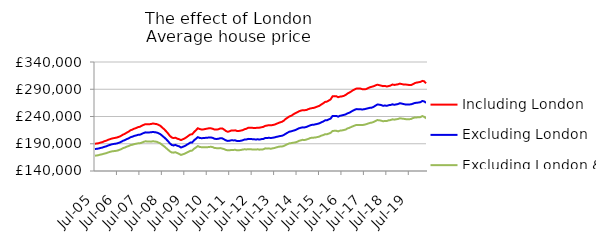
| Category | Including London | Excluding London | Excluding London & SE |
|---|---|---|---|
| 2005-07-01 | 190099.846 | 180338.943 | 168115.943 |
| 2005-08-01 | 190409.416 | 180707.116 | 168387.745 |
| 2005-09-01 | 191025.705 | 181294.079 | 169165.237 |
| 2005-10-01 | 192128.229 | 182260.003 | 170136.846 |
| 2005-11-01 | 193022.749 | 183020.557 | 170802.395 |
| 2005-12-01 | 194589.472 | 184321.051 | 171890.78 |
| 2006-01-01 | 195561.889 | 185223.855 | 172601.05 |
| 2006-02-01 | 197180.233 | 186694.526 | 173973.307 |
| 2006-03-01 | 198290.018 | 187883.534 | 175074.67 |
| 2006-04-01 | 199521.21 | 188954.872 | 175987.174 |
| 2006-05-01 | 200291.878 | 189620.06 | 176437.969 |
| 2006-06-01 | 200874.24 | 190048.53 | 176847.591 |
| 2006-07-01 | 201753.772 | 190830.896 | 177451.803 |
| 2006-08-01 | 202945.476 | 191932.237 | 178625.067 |
| 2006-09-01 | 204665.909 | 193486.107 | 180029.257 |
| 2006-10-01 | 206669.853 | 195431.198 | 181917.714 |
| 2006-11-01 | 208271.992 | 196704.296 | 182996.889 |
| 2006-12-01 | 210431.706 | 198484.218 | 184628.33 |
| 2007-01-01 | 212236.573 | 199867.99 | 185753.039 |
| 2007-02-01 | 214691.924 | 201953.448 | 187491.53 |
| 2007-03-01 | 215960.598 | 202950.014 | 188129.855 |
| 2007-04-01 | 217668.208 | 204390.327 | 189305.612 |
| 2007-05-01 | 218745.526 | 205176.529 | 190051.523 |
| 2007-06-01 | 220436.757 | 206350.676 | 190766.928 |
| 2007-07-01 | 221128.98 | 206601.586 | 190934.336 |
| 2007-08-01 | 222903.284 | 208023.687 | 191970.933 |
| 2007-09-01 | 224639.27 | 209648.69 | 193488.751 |
| 2007-10-01 | 225909.983 | 210886.574 | 194554.085 |
| 2007-11-01 | 225637.65 | 210701.658 | 194139.319 |
| 2007-12-01 | 225795.991 | 210808.016 | 194100.151 |
| 2008-01-01 | 226230.744 | 210997.948 | 193849.067 |
| 2008-02-01 | 227150.677 | 211685.752 | 194629.825 |
| 2008-03-01 | 226536.237 | 211131.036 | 194027.854 |
| 2008-04-01 | 226088.749 | 210687.499 | 193735.581 |
| 2008-05-01 | 224583.894 | 209243.33 | 192031.653 |
| 2008-06-01 | 222870.934 | 207605.676 | 190599.84 |
| 2008-07-01 | 219624.904 | 204552.197 | 187738.181 |
| 2008-08-01 | 216697.269 | 201783.679 | 185273.991 |
| 2008-09-01 | 213087.292 | 198550.708 | 182220.184 |
| 2008-10-01 | 209193.305 | 194954.131 | 179292.765 |
| 2008-11-01 | 204692.274 | 190946.059 | 176189.96 |
| 2008-12-01 | 201599.231 | 187849.92 | 174117.242 |
| 2009-01-01 | 200403.32 | 186878.072 | 173689.928 |
| 2009-02-01 | 201116.809 | 187902.199 | 174505.275 |
| 2009-03-01 | 199383.582 | 186328.236 | 172948.571 |
| 2009-04-01 | 198315.606 | 185259.882 | 171374.665 |
| 2009-05-01 | 196756.715 | 183093.397 | 169466.686 |
| 2009-06-01 | 198255.489 | 184493.743 | 170575.472 |
| 2009-07-01 | 199781.16 | 185725.435 | 171866.354 |
| 2009-08-01 | 202057.625 | 187894.019 | 173683.287 |
| 2009-09-01 | 204651.712 | 189897.228 | 175272.485 |
| 2009-10-01 | 206995.738 | 192147.604 | 177124.978 |
| 2009-11-01 | 207417.779 | 192401.732 | 177434.262 |
| 2009-12-01 | 211553.202 | 196348.095 | 180850.865 |
| 2010-01-01 | 214802.067 | 199095.743 | 183197.337 |
| 2010-02-01 | 218402.314 | 202123.005 | 185706.212 |
| 2010-03-01 | 216980.15 | 200671.83 | 184170.446 |
| 2010-04-01 | 216236.552 | 200161.69 | 183628.078 |
| 2010-05-01 | 216342.245 | 200449.238 | 183492.691 |
| 2010-06-01 | 217108.95 | 200783.748 | 183659.372 |
| 2010-07-01 | 217722.397 | 201016.807 | 183577.266 |
| 2010-08-01 | 218424.805 | 201510.881 | 184095.582 |
| 2010-09-01 | 218322.566 | 201613.716 | 184429.571 |
| 2010-10-01 | 217469.066 | 200750.626 | 183714.847 |
| 2010-11-01 | 215945.135 | 199049.754 | 182199.609 |
| 2010-12-01 | 216018.582 | 198791.843 | 181915.72 |
| 2011-01-01 | 216546.568 | 199114.513 | 181707.335 |
| 2011-02-01 | 218068.153 | 200152.075 | 182069.043 |
| 2011-03-01 | 218196.649 | 199966.213 | 181215.956 |
| 2011-04-01 | 216131.402 | 198173.837 | 180210.582 |
| 2011-05-01 | 213449.47 | 196231.995 | 178717.115 |
| 2011-06-01 | 211977.123 | 195154.451 | 177946.276 |
| 2011-07-01 | 212947.067 | 195568.747 | 178041.865 |
| 2011-08-01 | 214410.19 | 196445.281 | 178684.615 |
| 2011-09-01 | 214360.747 | 196165.982 | 178661.749 |
| 2011-10-01 | 214614.218 | 196213.259 | 178936.575 |
| 2011-11-01 | 213368.423 | 194966.866 | 177953.868 |
| 2011-12-01 | 213453.491 | 194865.197 | 178125.881 |
| 2012-01-01 | 214164.256 | 195514.42 | 178545.093 |
| 2012-02-01 | 214959.421 | 196404.975 | 179356.541 |
| 2012-03-01 | 216756.933 | 197817.955 | 179833.607 |
| 2012-04-01 | 217525.251 | 197898.314 | 179527.6 |
| 2012-05-01 | 219534.588 | 198949.536 | 180120.689 |
| 2012-06-01 | 219513.993 | 198774.052 | 180105.596 |
| 2012-07-01 | 219293.182 | 198462.317 | 179541.287 |
| 2012-08-01 | 218806.749 | 198165.774 | 179441.589 |
| 2012-09-01 | 219040.471 | 197834.003 | 179242.398 |
| 2012-10-01 | 219439.904 | 198189.625 | 179878.203 |
| 2012-11-01 | 219547.943 | 197705.403 | 179149.824 |
| 2012-12-01 | 220234.493 | 198496.975 | 179579.951 |
| 2013-01-01 | 220907.865 | 198670.322 | 179702.72 |
| 2013-02-01 | 222701.635 | 200446.331 | 181549.7 |
| 2013-03-01 | 223469.687 | 200554.563 | 181214.051 |
| 2013-04-01 | 224076.303 | 200944.861 | 181537.119 |
| 2013-05-01 | 223921.625 | 200574.706 | 180786.657 |
| 2013-06-01 | 224267.124 | 200953.441 | 181634.225 |
| 2013-07-01 | 225135.999 | 201680.442 | 182212.686 |
| 2013-08-01 | 226546.907 | 202586.569 | 183374.231 |
| 2013-09-01 | 227936.906 | 203391.678 | 184304.363 |
| 2013-10-01 | 229322.843 | 204234.069 | 184859.274 |
| 2013-11-01 | 230315.56 | 204602.914 | 184983.348 |
| 2013-12-01 | 232460.97 | 206225.51 | 185922.887 |
| 2014-01-01 | 235647.935 | 208367.783 | 187801.311 |
| 2014-02-01 | 237927.871 | 210397.831 | 189383.724 |
| 2014-03-01 | 240195.48 | 212153.651 | 190765.188 |
| 2014-04-01 | 241469.41 | 212884.813 | 191208.257 |
| 2014-05-01 | 243828.789 | 214011.28 | 191911.354 |
| 2014-06-01 | 245878.968 | 214988.938 | 192449.329 |
| 2014-07-01 | 247539.081 | 216525.132 | 193508.231 |
| 2014-08-01 | 249418.581 | 218299.792 | 195238.949 |
| 2014-09-01 | 250747.668 | 219267.162 | 196217.978 |
| 2014-10-01 | 251554.885 | 220056.663 | 197190.317 |
| 2014-11-01 | 251534.53 | 220011.241 | 196854.96 |
| 2014-12-01 | 251925.861 | 220856.382 | 197709.619 |
| 2015-01-01 | 253431.809 | 222218.445 | 198798.752 |
| 2015-02-01 | 254648.094 | 223740.73 | 200411.959 |
| 2015-03-01 | 255340.043 | 224687.291 | 201074.597 |
| 2015-04-01 | 255876.646 | 224953.264 | 201223.329 |
| 2015-05-01 | 257025.996 | 225743.668 | 201647.303 |
| 2015-06-01 | 258406.622 | 226541.496 | 202357.934 |
| 2015-07-01 | 259602.635 | 227594.255 | 203220.157 |
| 2015-08-01 | 262060.066 | 229279.729 | 204864.029 |
| 2015-09-01 | 264071.331 | 230781.509 | 205875.688 |
| 2015-10-01 | 266782.334 | 232880.229 | 207519.819 |
| 2015-11-01 | 267291.861 | 233078.556 | 207401.625 |
| 2015-12-01 | 269274.759 | 234653.062 | 208682.249 |
| 2016-01-01 | 271443.4 | 236250.053 | 209960.366 |
| 2016-02-01 | 277004.369 | 240964.363 | 213565.188 |
| 2016-03-01 | 277389.465 | 241069.016 | 213647.835 |
| 2016-04-01 | 277297.091 | 241113.692 | 213747.829 |
| 2016-05-01 | 275418.62 | 239697.966 | 212715.74 |
| 2016-06-01 | 276421.502 | 241310.921 | 214050.192 |
| 2016-07-01 | 276889.319 | 242056.992 | 214467.794 |
| 2016-08-01 | 277720.279 | 242891.392 | 215117.975 |
| 2016-09-01 | 279478.836 | 243807.73 | 215967.563 |
| 2016-10-01 | 282129.038 | 245841.601 | 218145.007 |
| 2016-11-01 | 283867.789 | 246937.83 | 219176.651 |
| 2016-12-01 | 285994.373 | 248943.025 | 220801.556 |
| 2017-01-01 | 288305.174 | 250939.187 | 222234.01 |
| 2017-02-01 | 290047.786 | 252664.53 | 223665.666 |
| 2017-03-01 | 291500.755 | 253648.484 | 224617.928 |
| 2017-04-01 | 291264.163 | 253147.959 | 224186.554 |
| 2017-05-01 | 291153.386 | 253193.423 | 224375.022 |
| 2017-06-01 | 290026.535 | 252897.924 | 224334.818 |
| 2017-07-01 | 289885.181 | 253387.675 | 224923.239 |
| 2017-08-01 | 290351.528 | 254209.469 | 225867.267 |
| 2017-09-01 | 292184.806 | 255170.845 | 227087.971 |
| 2017-10-01 | 293542.539 | 255913.818 | 228216.141 |
| 2017-11-01 | 294658.844 | 256267.421 | 228814.007 |
| 2017-12-01 | 295560.962 | 257834.073 | 230059.837 |
| 2018-01-01 | 297174.388 | 260013.605 | 231751.663 |
| 2018-02-01 | 298313.44 | 262036.077 | 233468.14 |
| 2018-03-01 | 297460.703 | 261701.24 | 233051.072 |
| 2018-04-01 | 296660.349 | 261063.081 | 232359.108 |
| 2018-05-01 | 295704.696 | 259681.755 | 231217.99 |
| 2018-06-01 | 296136.927 | 260172.462 | 231919.124 |
| 2018-07-01 | 295042.264 | 259596.91 | 231731.04 |
| 2018-08-01 | 295883.669 | 260772.254 | 232991.887 |
| 2018-09-01 | 296762.15 | 261122.803 | 233452.043 |
| 2018-10-01 | 298734.437 | 262365.668 | 234840.094 |
| 2018-11-01 | 297922.604 | 261492.642 | 234166.854 |
| 2018-12-01 | 298469.45 | 262147.763 | 234958.746 |
| 2019-01-01 | 299042.364 | 262837.217 | 235339.178 |
| 2019-02-01 | 300360.183 | 264328.567 | 236725.647 |
| 2019-03-01 | 299500.693 | 263727.099 | 236201.609 |
| 2019-04-01 | 298742.186 | 262834.623 | 235772.724 |
| 2019-05-01 | 298596.099 | 262140.54 | 235203.398 |
| 2019-06-01 | 298401.121 | 262006.422 | 234855.811 |
| 2019-07-01 | 297679.436 | 262018.197 | 234939.112 |
| 2019-08-01 | 297595.33 | 262406.913 | 235535.934 |
| 2019-09-01 | 299289.015 | 263570.987 | 237073.15 |
| 2019-10-01 | 301265.194 | 264841.851 | 238289.968 |
| 2019-11-01 | 302319.229 | 265208.782 | 238333.036 |
| 2019-12-01 | 302787.934 | 265650.519 | 238546.024 |
| 2020-01-01 | 303569.898 | 266236.339 | 238850.177 |
| 2020-02-01 | 305323.106 | 268473.359 | 240867.311 |
| 2020-03-01 | 304513.558 | 267739.72 | 239330.207 |
| 2020-04-01 | 300883.718 | 264981.529 | 236515.456 |